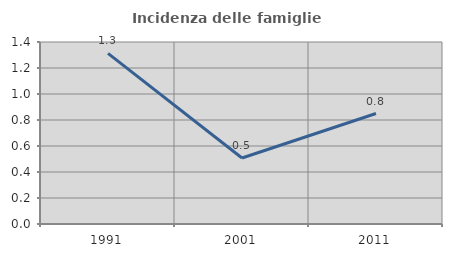
| Category | Incidenza delle famiglie numerose |
|---|---|
| 1991.0 | 1.313 |
| 2001.0 | 0.508 |
| 2011.0 | 0.85 |